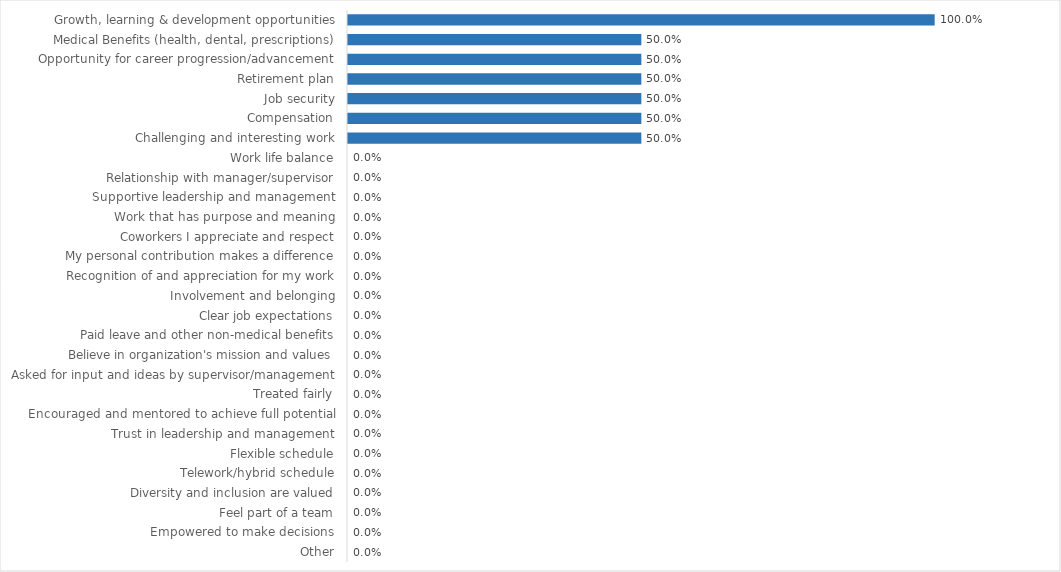
| Category | Labor Relations Board |
|---|---|
| Growth, learning & development opportunities | 1 |
| Medical Benefits (health, dental, prescriptions) | 0.5 |
| Opportunity for career progression/advancement | 0.5 |
| Retirement plan | 0.5 |
| Job security | 0.5 |
| Compensation | 0.5 |
| Challenging and interesting work | 0.5 |
| Work life balance | 0 |
| Relationship with manager/supervisor | 0 |
| Supportive leadership and management | 0 |
| Work that has purpose and meaning | 0 |
| Coworkers I appreciate and respect | 0 |
| My personal contribution makes a difference | 0 |
| Recognition of and appreciation for my work | 0 |
| Involvement and belonging | 0 |
| Clear job expectations | 0 |
| Paid leave and other non-medical benefits | 0 |
| Believe in organization's mission and values | 0 |
| Asked for input and ideas by supervisor/management | 0 |
| Treated fairly | 0 |
| Encouraged and mentored to achieve full potential | 0 |
| Trust in leadership and management | 0 |
| Flexible schedule | 0 |
| Telework/hybrid schedule | 0 |
| Diversity and inclusion are valued | 0 |
| Feel part of a team | 0 |
| Empowered to make decisions | 0 |
| Other | 0 |